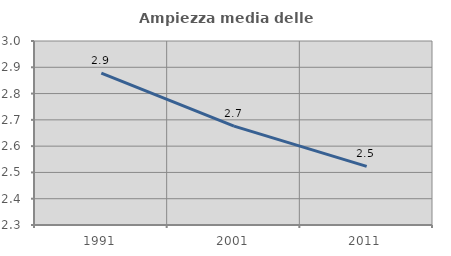
| Category | Ampiezza media delle famiglie |
|---|---|
| 1991.0 | 2.878 |
| 2001.0 | 2.676 |
| 2011.0 | 2.523 |